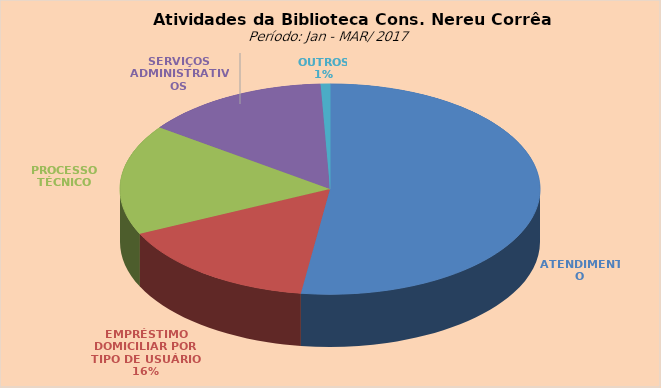
| Category | Series 0 |
|---|---|
| ATENDIMENTO | 5466 |
| EMPRÉSTIMO DOMICILIAR POR TIPO DE USUÁRIO | 1654 |
| PROCESSO TÉCNICO | 1774 |
| SERVIÇOS ADMINISTRATIVOS | 1500 |
| OUTROS | 75 |